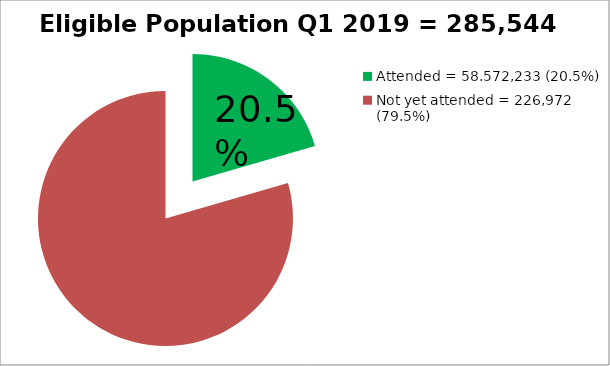
| Category | Eligible Population Q4 2018= 285,544 |
|---|---|
| Attended = 58.572,233 (20.5%) | 58572 |
| Not yet attended = 226,972 (79.5%)  | 226972 |